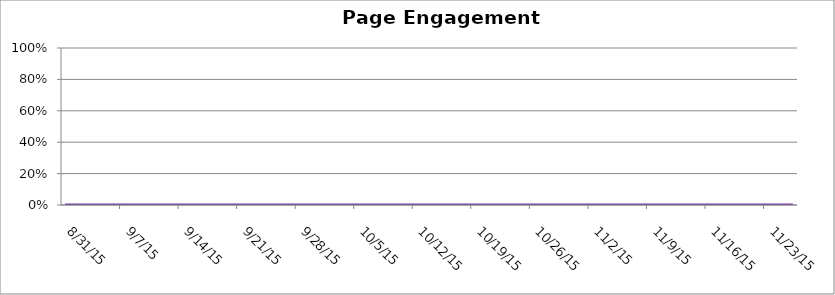
| Category | Page Engagement Rate |
|---|---|
| 8/31/15 | 0.163 |
| 9/1/15 | 0.138 |
| 9/2/15 | 0.149 |
| 9/3/15 | 0.166 |
| 9/4/15 | 0.089 |
| 9/5/15 | 0.026 |
| 9/6/15 | 0.261 |
| 9/7/15 | 0.125 |
| 9/8/15 | 0.074 |
| 9/9/15 | 0.173 |
| 9/10/15 | 0.109 |
| 9/11/15 | 0.145 |
| 9/12/15 | 0.172 |
| 9/13/15 | 0.163 |
| 9/14/15 | 0.098 |
| 9/15/15 | 0.189 |
| 9/16/15 | 0.094 |
| 9/17/15 | 0.112 |
| 9/18/15 | 0.116 |
| 9/19/15 | 0.086 |
| 9/20/15 | 0.114 |
| 9/21/15 | 0.208 |
| 9/22/15 | 0.096 |
| 9/23/15 | 0.12 |
| 9/24/15 | 0.097 |
| 9/25/15 | 0.24 |
| 9/26/15 | 0.165 |
| 9/27/15 | 0.142 |
| 9/28/15 | 0.206 |
| 9/29/15 | 0.207 |
| 9/30/15 | 0.172 |
| 10/1/15 | 0.131 |
| 10/2/15 | 0.146 |
| 10/3/15 | 0.161 |
| 10/4/15 | 0.126 |
| 10/5/15 | 0.144 |
| 10/6/15 | 0.103 |
| 10/7/15 | 0.217 |
| 10/8/15 | 0.262 |
| 10/9/15 | 0.182 |
| 10/10/15 | 0.222 |
| 10/11/15 | 0.375 |
| 10/12/15 | 0.143 |
| 10/13/15 | 0.089 |
| 10/14/15 | 0.137 |
| 10/15/15 | 0.074 |
| 10/16/15 | 0.083 |
| 10/17/15 | 0.133 |
| 10/18/15 | 0.233 |
| 10/19/15 | 0.144 |
| 10/20/15 | 0.104 |
| 10/21/15 | 0.079 |
| 10/22/15 | 0.097 |
| 10/23/15 | 0.229 |
| 10/24/15 | 0.179 |
| 10/25/15 | 0.263 |
| 10/26/15 | 0.1 |
| 10/27/15 | 0.078 |
| 10/28/15 | 0.068 |
| 10/29/15 | 0 |
| 10/30/15 | 0 |
| 10/31/15 | 0.333 |
| 11/1/15 | 0.205 |
| 11/2/15 | 0.132 |
| 11/3/15 | 0.146 |
| 11/4/15 | 0.118 |
| 11/5/15 | 0.25 |
| 11/6/15 | 0 |
| 11/7/15 | 0.25 |
| 11/8/15 | 0.167 |
| 11/9/15 | 0.095 |
| 11/10/15 | 0.316 |
| 11/11/15 | 0.6 |
| 11/12/15 | 0.2 |
| 11/13/15 | 0.093 |
| 11/14/15 | 0.09 |
| 11/15/15 | 0.051 |
| 11/16/15 | 0 |
| 11/17/15 | 0.4 |
| 11/18/15 | 1 |
| 11/19/15 | 0.25 |
| 11/20/15 | 0.308 |
| 11/21/15 | 0.147 |
| 11/22/15 | 0.333 |
| 11/23/15 | 0.4 |
| 11/24/15 | 0 |
| 11/25/15 | 0.131 |
| 11/26/15 | 0.059 |